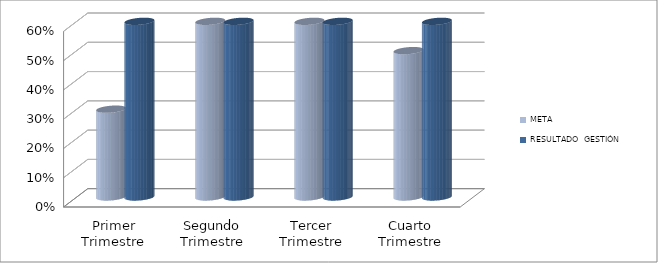
| Category | META | RESULTADO  GESTIÓN PERÍODO |
|---|---|---|
| Primer Trimestre | 0.3 | 1 |
| Segundo Trimestre | 0.6 | 1 |
| Tercer Trimestre | 0.6 | 1 |
| Cuarto Trimestre | 0.5 | 3 |